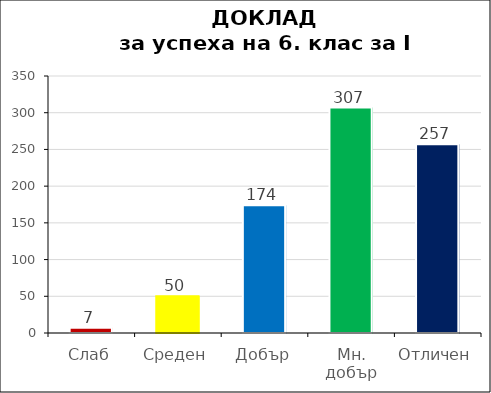
| Category | Series 0 |
|---|---|
| 0 | 7 |
| 1 | 50 |
| 2 | 174 |
| 3 | 307 |
| 4 | 257 |